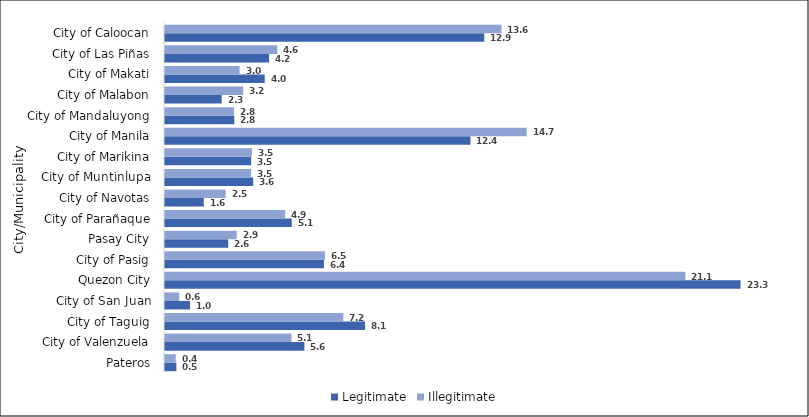
| Category | Legitimate | Illegitimate |
|---|---|---|
| Pateros | 0.461 | 0.436 |
| City of Valenzuela | 5.648 | 5.125 |
| City of Taguig | 8.107 | 7.226 |
| City of San Juan | 1.015 | 0.577 |
| Quezon City | 23.319 | 21.085 |
| City of Pasig | 6.439 | 6.483 |
| Pasay City | 2.564 | 2.904 |
| City of Parañaque | 5.136 | 4.868 |
| City of Navotas | 1.573 | 2.456 |
| City of Muntinlupa | 3.575 | 3.49 |
| City of Marikina | 3.488 | 3.523 |
| City of Manila | 12.377 | 14.654 |
| City of Mandaluyong | 2.808 | 2.798 |
| City of Malabon | 2.296 | 3.166 |
| City of Makati | 4.04 | 3.023 |
| City of Las Piñas | 4.218 | 4.554 |
| City of Caloocan | 12.937 | 13.634 |